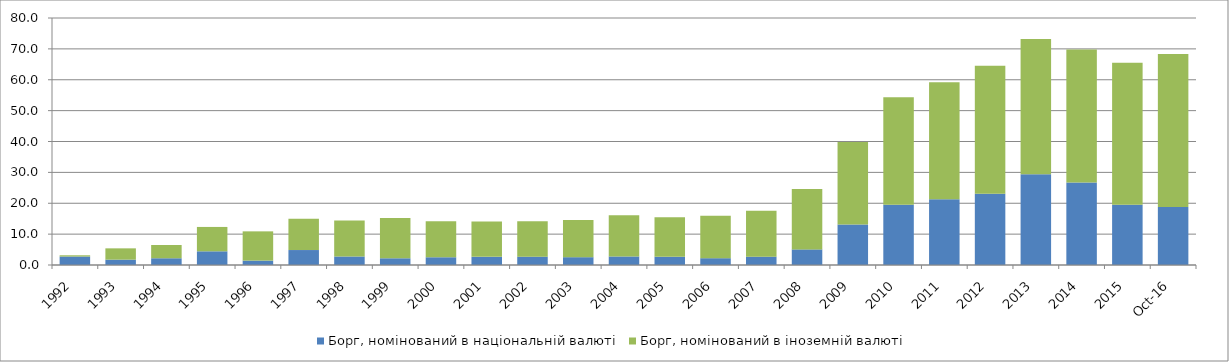
| Category | Борг, номінований в національній валюті | Борг, номінований в іноземній валюті |
|---|---|---|
| 1992.0 | 2.743 | 0.404 |
| 1993.0 | 1.732 | 3.661 |
| 1994.0 | 2.184 | 4.292 |
| 1995.0 | 4.433 | 7.895 |
| 1996.0 | 1.427 | 9.468 |
| 1997.0 | 4.845 | 10.164 |
| 1998.0 | 2.759 | 11.647 |
| 1999.0 | 2.176 | 13.072 |
| 2000.0 | 2.507 | 11.657 |
| 2001.0 | 2.65 | 11.419 |
| 2002.0 | 2.694 | 11.508 |
| 2003.0 | 2.533 | 12.01 |
| 2004.0 | 2.766 | 13.331 |
| 2005.0 | 2.666 | 12.809 |
| 2006.0 | 2.205 | 13.745 |
| 2007.0 | 2.69 | 14.883 |
| 2008.0 | 5.06 | 19.539 |
| 2009.0 | 13.143 | 26.67 |
| 2010.0 | 19.538 | 34.76 |
| 2011.0 | 21.329 | 37.894 |
| 2012.0 | 23.046 | 41.449 |
| 2013.0 | 29.397 | 43.765 |
| 2014.0 | 26.747 | 43.065 |
| 2015.0 | 19.515 | 45.99 |
| 42674.0 | 18.805 | 49.545 |